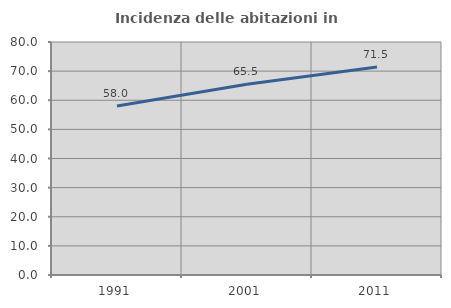
| Category | Incidenza delle abitazioni in proprietà  |
|---|---|
| 1991.0 | 58.043 |
| 2001.0 | 65.504 |
| 2011.0 | 71.452 |